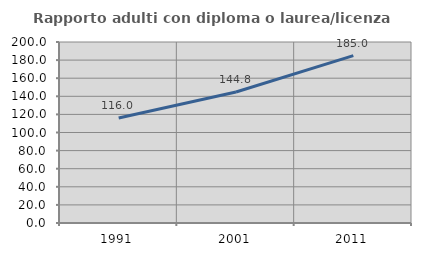
| Category | Rapporto adulti con diploma o laurea/licenza media  |
|---|---|
| 1991.0 | 115.956 |
| 2001.0 | 144.769 |
| 2011.0 | 184.956 |